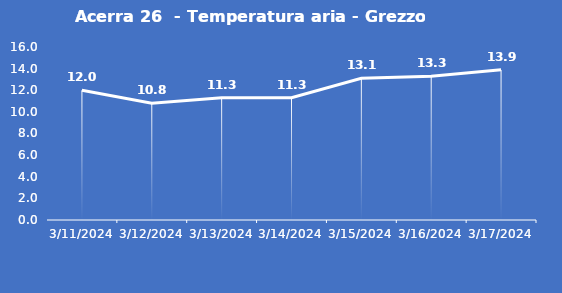
| Category | Acerra 26  - Temperatura aria - Grezzo (°C) |
|---|---|
| 3/11/24 | 12 |
| 3/12/24 | 10.8 |
| 3/13/24 | 11.3 |
| 3/14/24 | 11.3 |
| 3/15/24 | 13.1 |
| 3/16/24 | 13.3 |
| 3/17/24 | 13.9 |